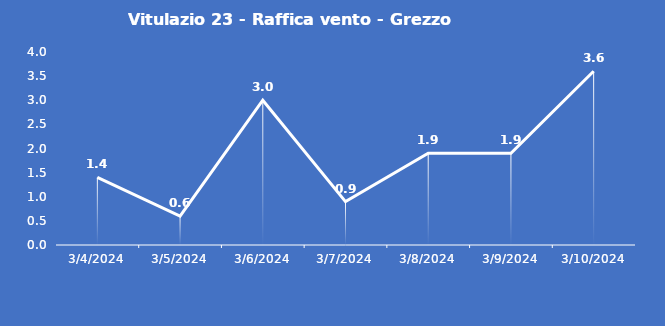
| Category | Vitulazio 23 - Raffica vento - Grezzo (m/s) |
|---|---|
| 3/4/24 | 1.4 |
| 3/5/24 | 0.6 |
| 3/6/24 | 3 |
| 3/7/24 | 0.9 |
| 3/8/24 | 1.9 |
| 3/9/24 | 1.9 |
| 3/10/24 | 3.6 |